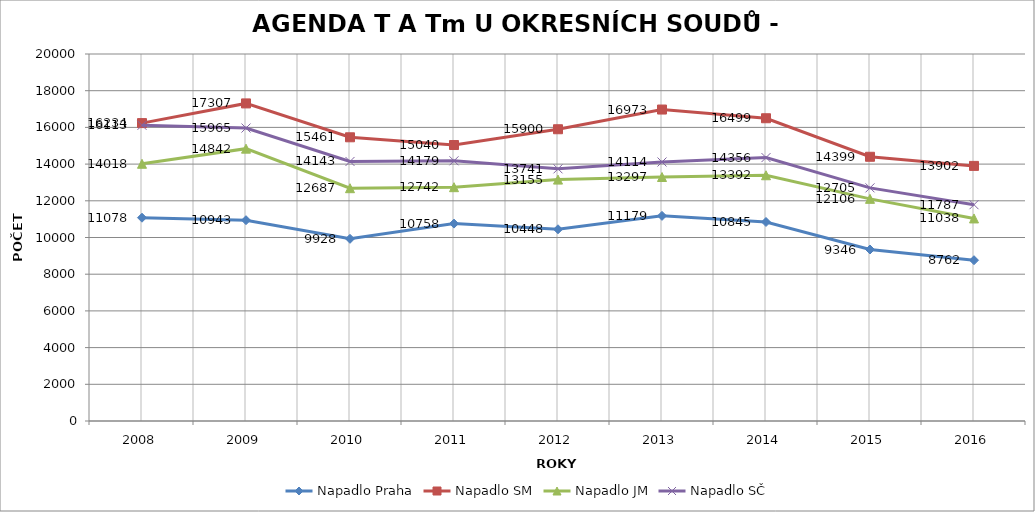
| Category | Napadlo Praha | Napadlo SM | Napadlo JM | Napadlo SČ |
|---|---|---|---|---|
| 2008.0 | 11078 | 16234 | 14018 | 16113 |
| 2009.0 | 10943 | 17307 | 14842 | 15965 |
| 2010.0 | 9928 | 15461 | 12687 | 14143 |
| 2011.0 | 10758 | 15040 | 12742 | 14179 |
| 2012.0 | 10448 | 15900 | 13155 | 13741 |
| 2013.0 | 11179 | 16973 | 13297 | 14114 |
| 2014.0 | 10845 | 16499 | 13392 | 14356 |
| 2015.0 | 9346 | 14399 | 12106 | 12705 |
| 2016.0 | 8762 | 13902 | 11038 | 11787 |